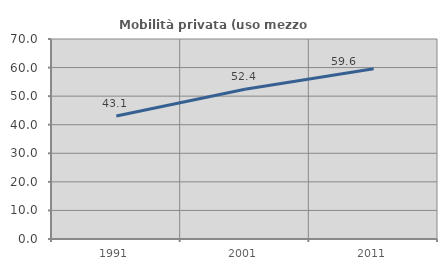
| Category | Mobilità privata (uso mezzo privato) |
|---|---|
| 1991.0 | 43.062 |
| 2001.0 | 52.414 |
| 2011.0 | 59.574 |